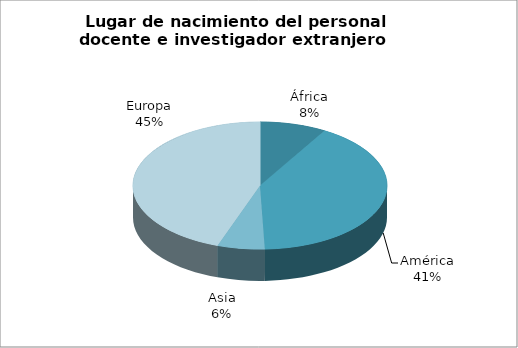
| Category | Series 0 |
|---|---|
| África | 7 |
| América | 34 |
| Asia | 5 |
| Europa | 37 |